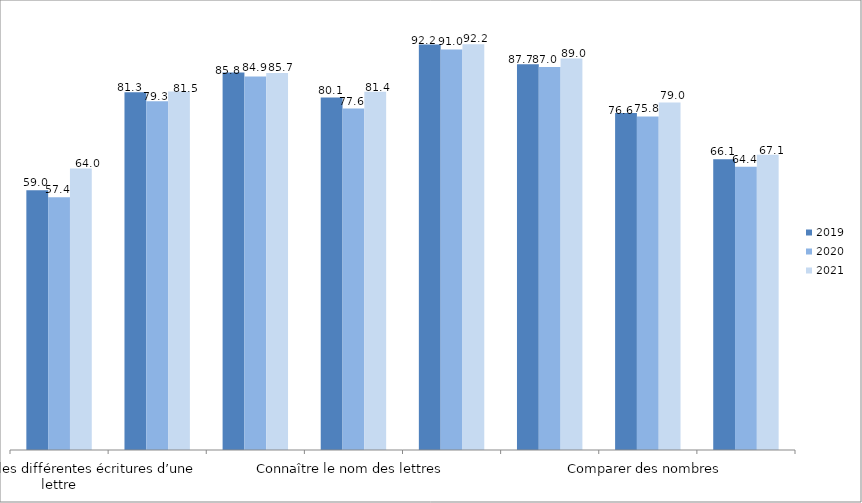
| Category | 2019 | 2020 | 2021 |
|---|---|---|---|
| Reconnaître les différentes écritures d’une lettre | 59.03 | 57.44 | 64 |
| Manipuler des syllabes | 81.28 | 79.28 | 81.5 |
| Comprendre un texte à l'oral | 85.8 | 84.9 | 85.7 |
| Connaître le nom des lettres | 80.1 | 77.6 | 81.4 |
| Lire des nombres entiers | 92.15 | 91.03 | 92.2 |
| Écrire des nombres entiers | 87.67 | 87.03 | 89 |
| Comparer des nombres | 76.6 | 75.8 | 79 |
| Résoudre des problèmes | 66.1 | 64.4 | 67.1 |